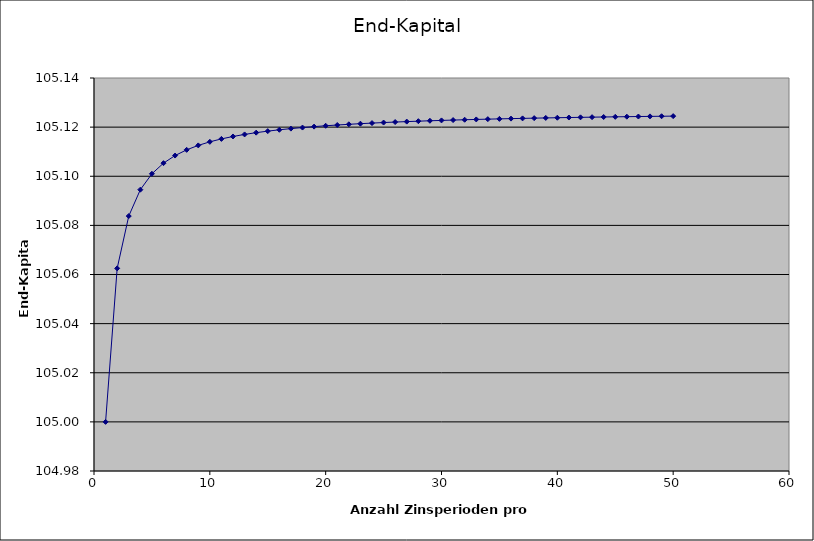
| Category | End-Kapital |
|---|---|
| 1.0 | 105 |
| 2.0 | 105.062 |
| 3.0 | 105.084 |
| 4.0 | 105.095 |
| 5.0 | 105.101 |
| 6.0 | 105.105 |
| 7.0 | 105.108 |
| 8.0 | 105.111 |
| 9.0 | 105.113 |
| 10.0 | 105.114 |
| 11.0 | 105.115 |
| 12.0 | 105.116 |
| 13.0 | 105.117 |
| 14.0 | 105.118 |
| 15.0 | 105.118 |
| 16.0 | 105.119 |
| 17.0 | 105.119 |
| 18.0 | 105.12 |
| 19.0 | 105.12 |
| 20.0 | 105.121 |
| 21.0 | 105.121 |
| 22.0 | 105.121 |
| 23.0 | 105.121 |
| 24.0 | 105.122 |
| 25.0 | 105.122 |
| 26.0 | 105.122 |
| 27.0 | 105.122 |
| 28.0 | 105.122 |
| 29.0 | 105.123 |
| 30.0 | 105.123 |
| 31.0 | 105.123 |
| 32.0 | 105.123 |
| 33.0 | 105.123 |
| 34.0 | 105.123 |
| 35.0 | 105.123 |
| 36.0 | 105.123 |
| 37.0 | 105.124 |
| 38.0 | 105.124 |
| 39.0 | 105.124 |
| 40.0 | 105.124 |
| 41.0 | 105.124 |
| 42.0 | 105.124 |
| 43.0 | 105.124 |
| 44.0 | 105.124 |
| 45.0 | 105.124 |
| 46.0 | 105.124 |
| 47.0 | 105.124 |
| 48.0 | 105.124 |
| 49.0 | 105.124 |
| 50.0 | 105.124 |